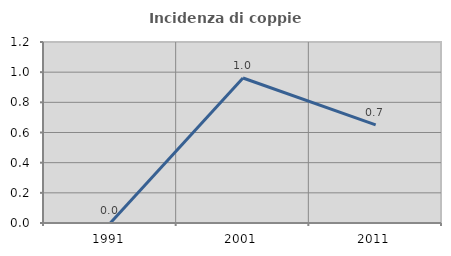
| Category | Incidenza di coppie miste |
|---|---|
| 1991.0 | 0 |
| 2001.0 | 0.962 |
| 2011.0 | 0.65 |